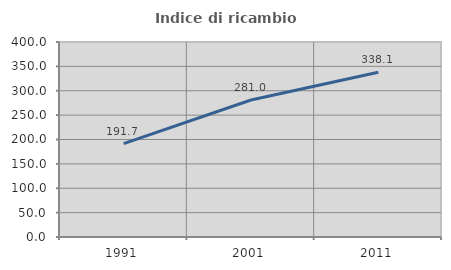
| Category | Indice di ricambio occupazionale  |
|---|---|
| 1991.0 | 191.667 |
| 2001.0 | 281.034 |
| 2011.0 | 338.095 |